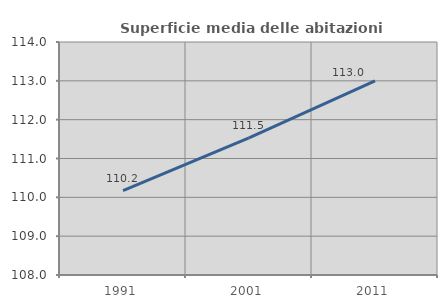
| Category | Superficie media delle abitazioni occupate |
|---|---|
| 1991.0 | 110.172 |
| 2001.0 | 111.533 |
| 2011.0 | 113.002 |